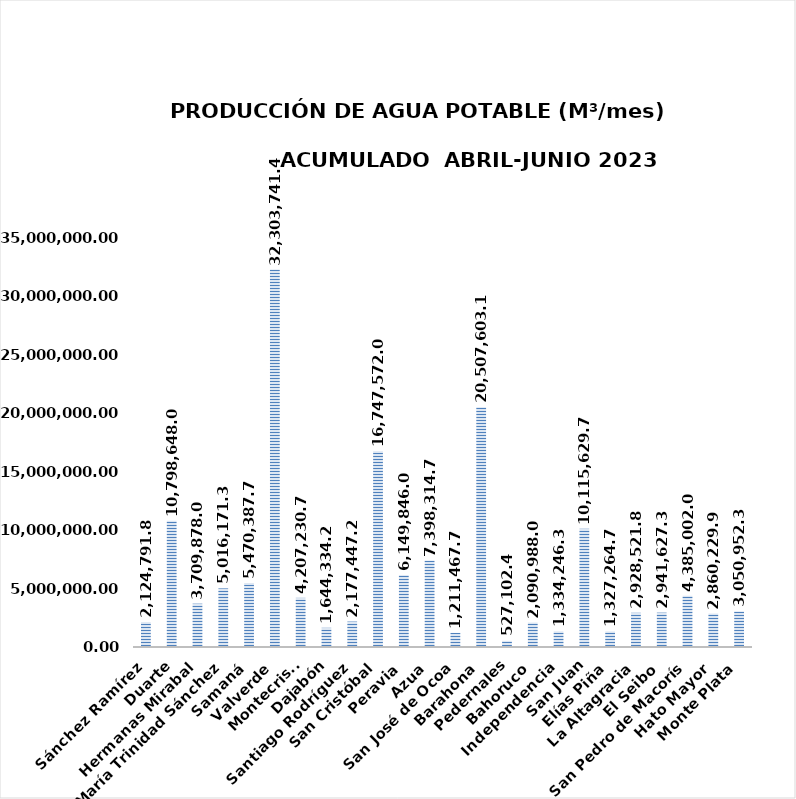
| Category | 2,124,791.81 |
|---|---|
| Sánchez Ramírez | 2124791.81 |
| Duarte | 10798648.054 |
| Hermanas Mirabal | 3709878.046 |
| María Trinidad Sánchez | 5016171.314 |
| Samaná | 5470387.706 |
| Valverde | 32303741.472 |
| Montecristi | 4207230.72 |
| Dajabón | 1644334.244 |
| Santiago Rodríguez | 2177447.284 |
| San Cristóbal | 16747572.057 |
| Peravia | 6149846.001 |
| Azua | 7398314.764 |
| San José de Ocoa | 1211467.764 |
| Barahona | 20507603.112 |
| Pedernales | 527102.44 |
| Bahoruco | 2090988.01 |
| Independencia | 1334246.37 |
| San Juan | 10115629.724 |
| Elías Piña | 1327264.758 |
| La Altagracia | 2928521.8 |
| El Seibo | 2941627.308 |
| San Pedro de Macorís | 4385002.07 |
| Hato Mayor | 2860229.952 |
| Monte Plata | 3050952.326 |